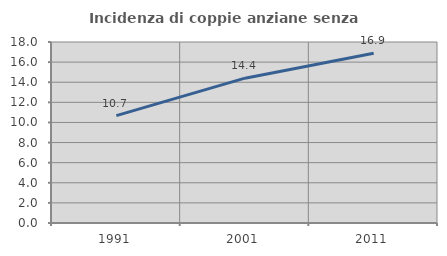
| Category | Incidenza di coppie anziane senza figli  |
|---|---|
| 1991.0 | 10.678 |
| 2001.0 | 14.402 |
| 2011.0 | 16.876 |